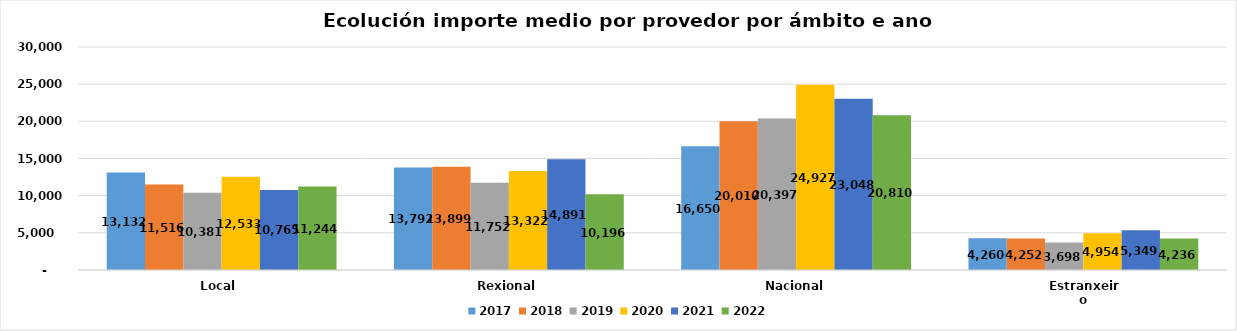
| Category | 2017 | 2018 | 2019 | 2020 | 2021 | 2022 |
|---|---|---|---|---|---|---|
| Local  | 13132.48 | 11515.626 | 10380.961 | 12532.996 | 10764.77 | 11243.767 |
| Rexional | 13792.481 | 13898.72 | 11752.278 | 13322.488 | 14891.19 | 10196.298 |
| Nacional | 16649.888 | 20009.856 | 20397.298 | 24926.802 | 23047.83 | 20809.892 |
| Estranxeiro | 4260.239 | 4252.076 | 3697.782 | 4954.425 | 5348.95 | 4235.535 |